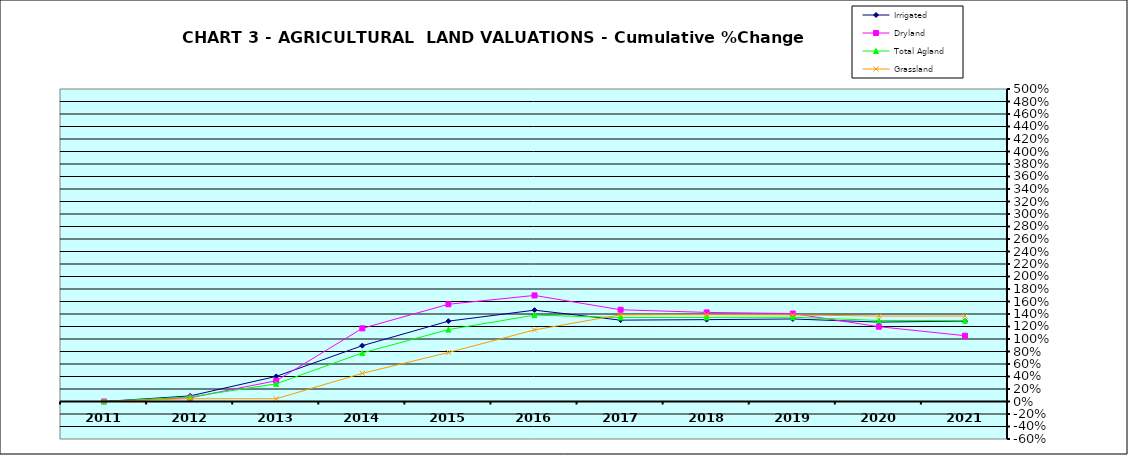
| Category | Irrigated | Dryland | Total Agland | Grassland |
|---|---|---|---|---|
| 2011.0 | 0 | 0 | 0 | 0 |
| 2012.0 | 0.089 | 0.06 | 0.073 | 0.044 |
| 2013.0 | 0.402 | 0.332 | 0.283 | 0.044 |
| 2014.0 | 0.893 | 1.17 | 0.777 | 0.45 |
| 2015.0 | 1.286 | 1.556 | 1.15 | 0.784 |
| 2016.0 | 1.461 | 1.697 | 1.382 | 1.146 |
| 2017.0 | 1.302 | 1.468 | 1.343 | 1.387 |
| 2018.0 | 1.31 | 1.425 | 1.345 | 1.389 |
| 2019.0 | 1.32 | 1.407 | 1.349 | 1.386 |
| 2020.0 | 1.27 | 1.197 | 1.296 | 1.366 |
| 2021.0 | 1.287 | 1.053 | 1.293 | 1.367 |